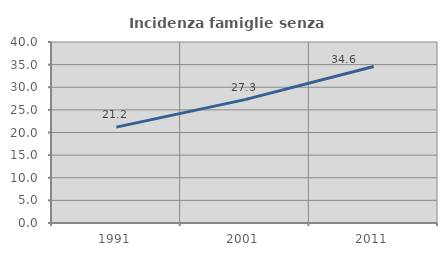
| Category | Incidenza famiglie senza nuclei |
|---|---|
| 1991.0 | 21.182 |
| 2001.0 | 27.263 |
| 2011.0 | 34.572 |